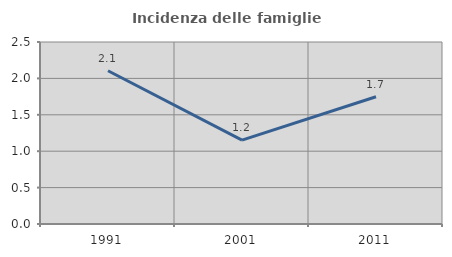
| Category | Incidenza delle famiglie numerose |
|---|---|
| 1991.0 | 2.105 |
| 2001.0 | 1.153 |
| 2011.0 | 1.747 |